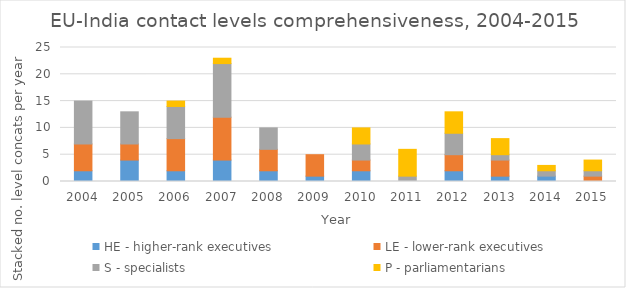
| Category | HE - higher-rank executives | LE - lower-rank executives | S - specialists | P - parliamentarians |
|---|---|---|---|---|
| 2004.0 | 2 | 5 | 8 | 0 |
| 2005.0 | 4 | 3 | 6 | 0 |
| 2006.0 | 2 | 6 | 6 | 1 |
| 2007.0 | 4 | 8 | 10 | 1 |
| 2008.0 | 2 | 4 | 4 | 0 |
| 2009.0 | 1 | 4 | 0 | 0 |
| 2010.0 | 2 | 2 | 3 | 3 |
| 2011.0 | 0 | 0 | 1 | 5 |
| 2012.0 | 2 | 3 | 4 | 4 |
| 2013.0 | 1 | 3 | 1 | 3 |
| 2014.0 | 1 | 0 | 1 | 1 |
| 2015.0 | 0 | 1 | 1 | 2 |